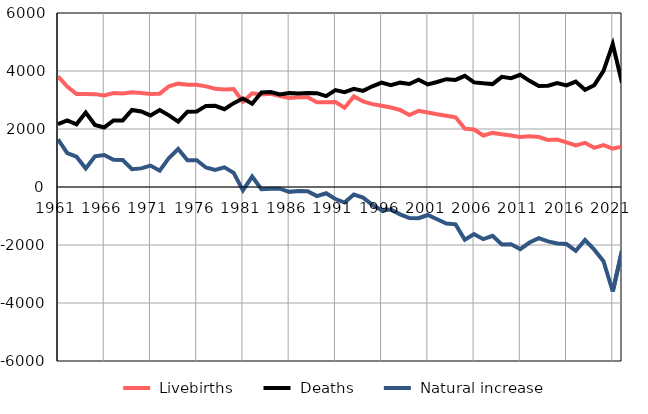
| Category |  Livebirths |  Deaths |  Natural increase |
|---|---|---|---|
| 1961.0 | 3813 | 2172 | 1641 |
| 1962.0 | 3465 | 2294 | 1171 |
| 1963.0 | 3205 | 2162 | 1043 |
| 1964.0 | 3207 | 2568 | 639 |
| 1965.0 | 3202 | 2142 | 1060 |
| 1966.0 | 3157 | 2054 | 1103 |
| 1967.0 | 3238 | 2297 | 941 |
| 1968.0 | 3225 | 2297 | 928 |
| 1969.0 | 3270 | 2658 | 612 |
| 1970.0 | 3245 | 2603 | 642 |
| 1971.0 | 3208 | 2469 | 739 |
| 1972.0 | 3218 | 2657 | 561 |
| 1973.0 | 3473 | 2471 | 1002 |
| 1974.0 | 3564 | 2252 | 1312 |
| 1975.0 | 3523 | 2599 | 924 |
| 1976.0 | 3528 | 2606 | 922 |
| 1977.0 | 3471 | 2797 | 674 |
| 1978.0 | 3391 | 2801 | 590 |
| 1979.0 | 3360 | 2682 | 678 |
| 1980.0 | 3378 | 2891 | 487 |
| 1981.0 | 2937 | 3053 | -116 |
| 1982.0 | 3229 | 2870 | 359 |
| 1983.0 | 3187 | 3261 | -74 |
| 1984.0 | 3213 | 3274 | -61 |
| 1985.0 | 3135 | 3193 | -58 |
| 1986.0 | 3073 | 3240 | -167 |
| 1987.0 | 3093 | 3227 | -134 |
| 1988.0 | 3098 | 3244 | -146 |
| 1989.0 | 2924 | 3237 | -313 |
| 1990.0 | 2921 | 3136 | -215 |
| 1991.0 | 2928 | 3344 | -416 |
| 1992.0 | 2733 | 3270 | -537 |
| 1993.0 | 3124 | 3383 | -259 |
| 1994.0 | 2950 | 3314 | -364 |
| 1995.0 | 2857 | 3472 | -615 |
| 1996.0 | 2804 | 3602 | -798 |
| 1997.0 | 2739 | 3512 | -773 |
| 1998.0 | 2656 | 3598 | -942 |
| 1999.0 | 2482 | 3552 | -1070 |
| 2000.0 | 2625 | 3700 | -1075 |
| 2001.0 | 2571 | 3536 | -965 |
| 2002.0 | 2506 | 3620 | -1114 |
| 2003.0 | 2457 | 3717 | -1260 |
| 2004.0 | 2405 | 3693 | -1288 |
| 2005.0 | 2013 | 3834 | -1821 |
| 2006.0 | 1982 | 3608 | -1626 |
| 2007.0 | 1776 | 3574 | -1798 |
| 2008.0 | 1865 | 3548 | -1683 |
| 2009.0 | 1818 | 3799 | -1981 |
| 2010.0 | 1779 | 3753 | -1974 |
| 2011.0 | 1726 | 3870 | -2144 |
| 2012.0 | 1746 | 3662 | -1916 |
| 2013.0 | 1724 | 3486 | -1762 |
| 2014.0 | 1621 | 3495 | -1874 |
| 2015.0 | 1635 | 3585 | -1950 |
| 2016.0 | 1536 | 3503 | -1967 |
| 2017.0 | 1435 | 3634 | -2199 |
| 2018.0 | 1524 | 3352 | -1828 |
| 2019.0 | 1350 | 3511 | -2161 |
| 2020.0 | 1445 | 4004 | -2559 |
| 2021.0 | 1322 | 4925 | -3603 |
| 2022.0 | 1398 | 3597 | -2199 |